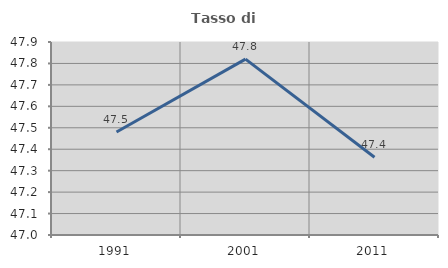
| Category | Tasso di occupazione   |
|---|---|
| 1991.0 | 47.48 |
| 2001.0 | 47.82 |
| 2011.0 | 47.362 |